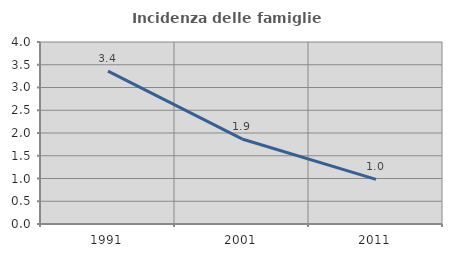
| Category | Incidenza delle famiglie numerose |
|---|---|
| 1991.0 | 3.361 |
| 2001.0 | 1.869 |
| 2011.0 | 0.98 |